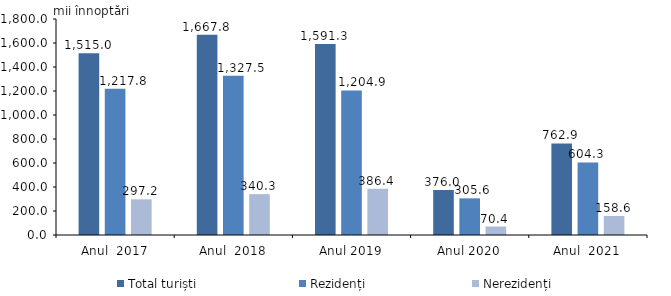
| Category | Total turiști | Rezidenți  | Nerezidenți |
|---|---|---|---|
| Anul  2017 | 1515 | 1217.8 | 297.2 |
| Anul  2018 | 1667.8 | 1327.45 | 340.3 |
| Anul 2019 | 1591.3 | 1204.9 | 386.4 |
| Anul 2020 | 376 | 305.6 | 70.4 |
| Anul  2021 | 762.9 | 604.25 | 158.6 |